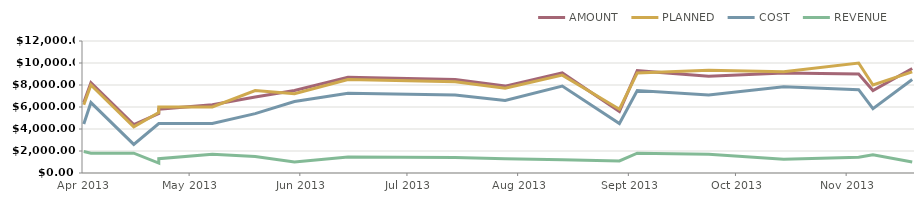
| Category | AMOUNT | PLANNED | COST | REVENUE |
|---|---|---|---|---|
| 2013-04-23 | 6400 | 6200 | 4450 | 1950 |
| 2013-04-25 | 8200 | 8000 | 6400 | 1800 |
| 2013-05-07 | 4400 | 4200 | 2600 | 1800 |
| 2013-05-14 | 5400 | 5500 | 4500 | 900 |
| 2013-05-14 | 5800 | 6000 | 4500 | 1300 |
| 2013-05-29 | 6200 | 6000 | 4500 | 1700 |
| 2013-06-10 | 6900 | 7500 | 5400 | 1500 |
| 2013-06-21 | 7500 | 7200 | 6500 | 1000 |
| 2013-07-06 | 8700 | 8500 | 7250 | 1450 |
| 2013-08-05 | 8500 | 8300 | 7100 | 1400 |
| 2013-08-19 | 7900 | 7700 | 6600 | 1300 |
| 2013-09-04 | 9100 | 8900 | 7900 | 1200 |
| 2013-09-20 | 5600 | 5800 | 4500 | 1100 |
| 2013-09-25 | 9300 | 9100 | 7500 | 1800 |
| 2013-10-15 | 8800 | 9350 | 7100 | 1700 |
| 2013-11-05 | 9100 | 9200 | 7850 | 1250 |
| 2013-11-26 | 9000 | 10000 | 7575 | 1425 |
| 2013-11-30 | 7500 | 8000 | 5850 | 1650 |
| 2013-12-11 | 9500 | 9200 | 8500 | 1000 |